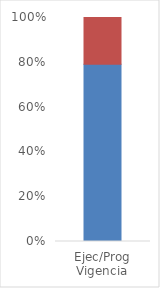
| Category | Series 0 | Series 1 |
|---|---|---|
| Ejec/Prog
Vigencia | 1 | 0.264 |